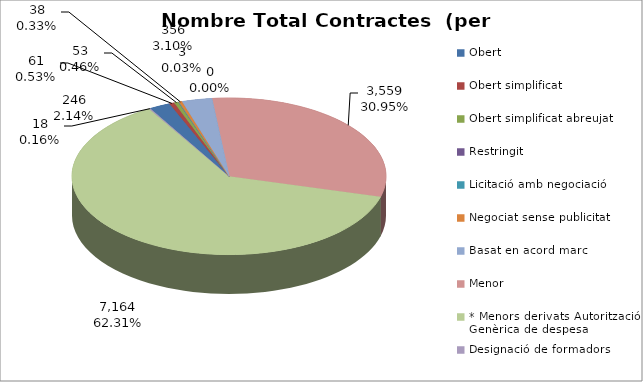
| Category | Nombre Total Contractes |
|---|---|
| Obert | 246 |
| Obert simplificat | 61 |
| Obert simplificat abreujat | 53 |
| Restringit | 0 |
| Licitació amb negociació | 3 |
| Negociat sense publicitat | 38 |
| Basat en acord marc | 356 |
| Menor | 3559 |
| * Menors derivats Autorització Genèrica de despesa | 7164 |
| Designació de formadors | 18 |